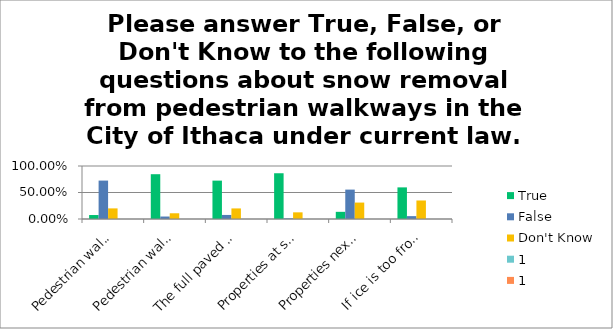
| Category | True | False | Don't Know | 1 |
|---|---|---|---|---|
| Pedestrian walkways must be cleared of snow, but not ice | 0.075 | 0.725 | 0.2 | 0 |
| Pedestrian walkways must be cleared within 24 hours after the start of a snowfall | 0.845 | 0.047 | 0.108 | 0 |
| The full paved width of the sidewalk must be cleared | 0.724 | 0.076 | 0.2 | 0 |
| Properties at street corners must clear sidewalks on all sides, not just the front | 0.863 | 0.011 | 0.126 | 0 |
| Properties next to a street crossing do not need to clear the curb cut leading to the crosswalk | 0.135 | 0.555 | 0.31 | 0 |
| If ice is too frozen to remove, a suitable material must be placed to provide traction for pedestrians | 0.597 | 0.054 | 0.349 | 0 |